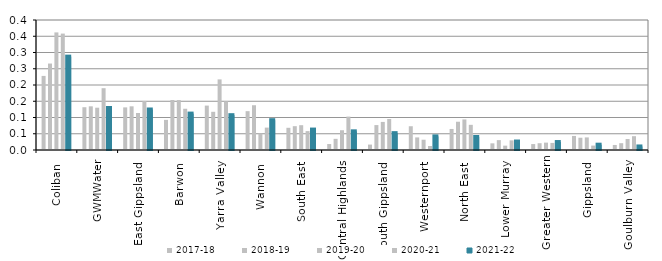
| Category | 2017-18 | 2018-19 | 2019-20 | 2020-21 | 2021-22 |
|---|---|---|---|---|---|
| Coliban  | 0.228 | 0.266 | 0.362 | 0.358 | 0.287 |
| GWMWater | 0.132 | 0.134 | 0.13 | 0.19 | 0.129 |
| East Gippsland  | 0.131 | 0.134 | 0.114 | 0.151 | 0.125 |
| Barwon  | 0.093 | 0.154 | 0.154 | 0.127 | 0.112 |
| Yarra Valley  | 0.137 | 0.118 | 0.217 | 0.15 | 0.107 |
| Wannon  | 0.12 | 0.138 | 0.051 | 0.069 | 0.092 |
| South East  | 0.068 | 0.073 | 0.076 | 0.058 | 0.063 |
| Central Highlands  | 0.018 | 0.034 | 0.061 | 0.103 | 0.057 |
| South Gippsland  | 0.017 | 0.077 | 0.086 | 0.095 | 0.052 |
| Westernport  | 0.073 | 0.039 | 0.032 | 0.012 | 0.042 |
| North East  | 0.065 | 0.087 | 0.094 | 0.077 | 0.04 |
| Lower Murray  | 0.02 | 0.03 | 0.013 | 0.03 | 0.026 |
| Greater Western | 0.018 | 0.021 | 0.023 | 0.022 | 0.024 |
| Gippsland  | 0.043 | 0.038 | 0.039 | 0.014 | 0.016 |
| Goulburn Valley  | 0.015 | 0.021 | 0.034 | 0.043 | 0.011 |